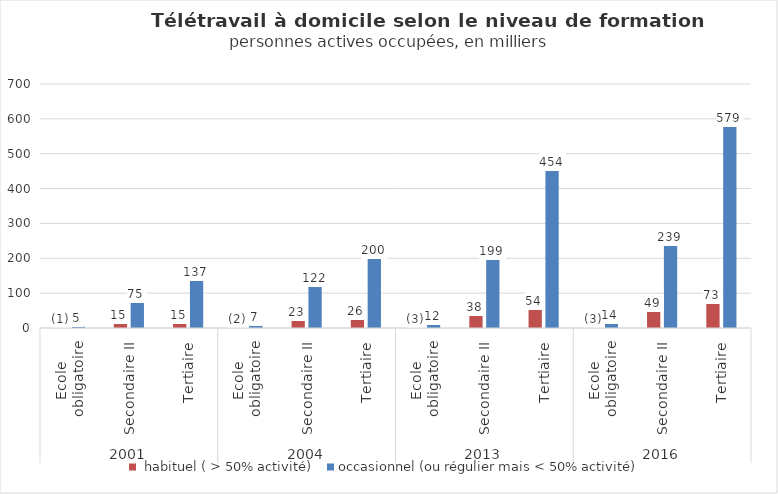
| Category |  habituel ( > 50% activité) | occasionnel (ou régulier mais < 50% activité) |
|---|---|---|
| 0 | 1.457 | 5.098 |
| 1 | 14.624 | 74.986 |
| 2 | 15.265 | 136.869 |
| 3 | 1.999 | 7.328 |
| 4 | 23.271 | 121.797 |
| 5 | 26.395 | 199.903 |
| 6 | 2.686 | 11.617 |
| 7 | 37.804 | 198.747 |
| 8 | 53.913 | 453.729 |
| 9 | 2.783 | 13.894 |
| 10 | 49.065 | 238.903 |
| 11 | 72.966 | 579.391 |